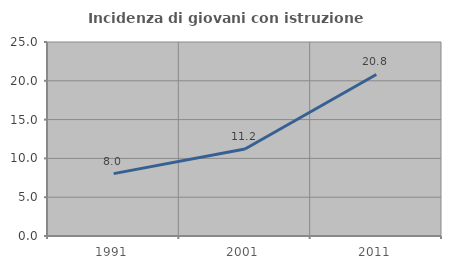
| Category | Incidenza di giovani con istruzione universitaria |
|---|---|
| 1991.0 | 8.041 |
| 2001.0 | 11.208 |
| 2011.0 | 20.818 |